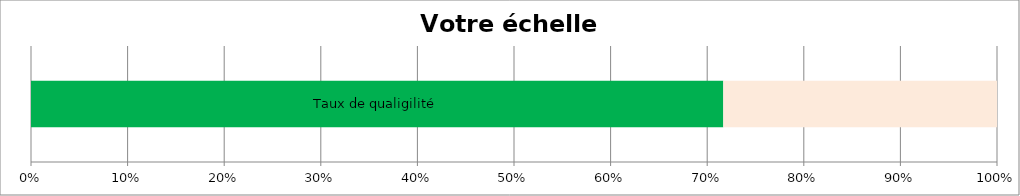
| Category | Taux d'agilité | Reste à faire |
|---|---|---|
| 0 | 0.717 | 0.283 |